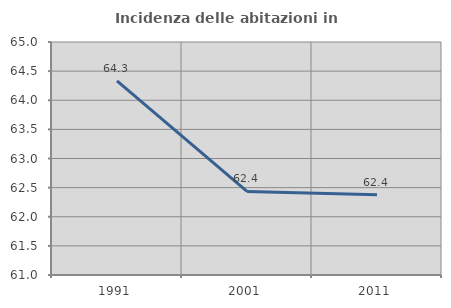
| Category | Incidenza delle abitazioni in proprietà  |
|---|---|
| 1991.0 | 64.333 |
| 2001.0 | 62.434 |
| 2011.0 | 62.378 |